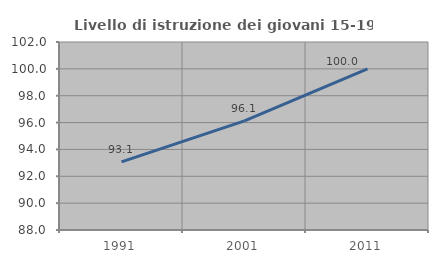
| Category | Livello di istruzione dei giovani 15-19 anni |
|---|---|
| 1991.0 | 93.077 |
| 2001.0 | 96.124 |
| 2011.0 | 100 |